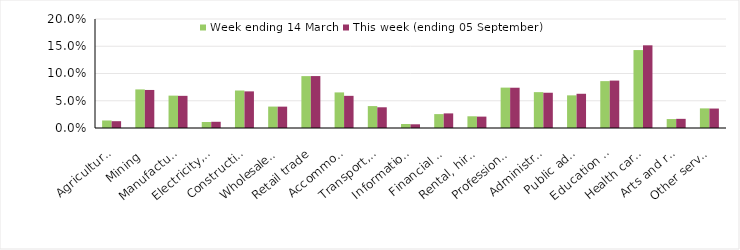
| Category | Week ending 14 March | This week (ending 05 September) |
|---|---|---|
| Agriculture, forestry and fishing | 0.014 | 0.012 |
| Mining | 0.071 | 0.07 |
| Manufacturing | 0.059 | 0.059 |
| Electricity, gas, water and waste services | 0.011 | 0.011 |
| Construction | 0.069 | 0.067 |
| Wholesale trade | 0.039 | 0.039 |
| Retail trade | 0.095 | 0.095 |
| Accommodation and food services | 0.065 | 0.059 |
| Transport, postal and warehousing | 0.04 | 0.038 |
| Information media and telecommunications | 0.007 | 0.007 |
| Financial and insurance services | 0.026 | 0.027 |
| Rental, hiring and real estate services | 0.022 | 0.021 |
| Professional, scientific and technical services | 0.074 | 0.074 |
| Administrative and support services | 0.066 | 0.065 |
| Public administration and safety | 0.06 | 0.063 |
| Education and training | 0.086 | 0.087 |
| Health care and social assistance | 0.143 | 0.152 |
| Arts and recreation services | 0.016 | 0.017 |
| Other services | 0.036 | 0.036 |